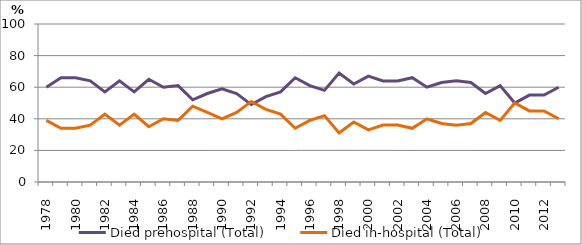
| Category | Died prehospital (Total) | Died in-hospital (Total) |
|---|---|---|
| 1978.0 | 60 | 39 |
| 1979.0 | 66 | 34 |
| 1980.0 | 66 | 34 |
| 1981.0 | 64 | 36 |
| 1982.0 | 57 | 43 |
| 1983.0 | 64 | 36 |
| 1984.0 | 57 | 43 |
| 1985.0 | 65 | 35 |
| 1986.0 | 60 | 40 |
| 1987.0 | 61 | 39 |
| 1988.0 | 52 | 48 |
| 1989.0 | 56 | 44 |
| 1990.0 | 59 | 40 |
| 1991.0 | 56 | 44 |
| 1992.0 | 49 | 51 |
| 1993.0 | 54 | 46 |
| 1994.0 | 57 | 43 |
| 1995.0 | 66 | 34 |
| 1996.0 | 61 | 39 |
| 1997.0 | 58 | 42 |
| 1998.0 | 69 | 31 |
| 1999.0 | 62 | 38 |
| 2000.0 | 67 | 33 |
| 2001.0 | 64 | 36 |
| 2002.0 | 64 | 36 |
| 2003.0 | 66 | 34 |
| 2004.0 | 60 | 40 |
| 2005.0 | 63 | 37 |
| 2006.0 | 64 | 36 |
| 2007.0 | 63 | 37 |
| 2008.0 | 56 | 44 |
| 2009.0 | 61 | 39 |
| 2010.0 | 50 | 50 |
| 2011.0 | 55 | 45 |
| 2012.0 | 55 | 45 |
| 2013.0 | 60 | 40 |